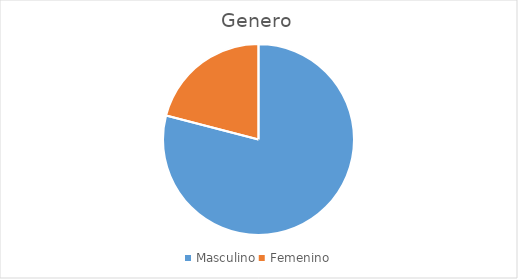
| Category | Series 0 |
|---|---|
| Masculino | 83 |
| Femenino | 22 |